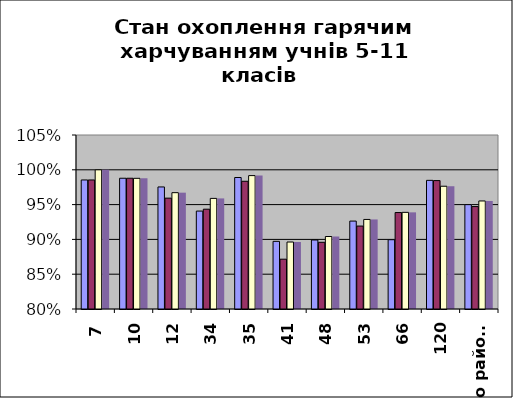
| Category | Series 0 | Series 1 | Series 2 | Series 3 |
|---|---|---|---|---|
| 7 | 0.985 | 0.985 | 1 | 1 |
| 10 | 0.988 | 0.988 | 0.988 | 0.988 |
| 12 | 0.975 | 0.959 | 0.967 | 0.967 |
| 34 | 0.941 | 0.943 | 0.959 | 0.959 |
| 35 | 0.989 | 0.984 | 0.992 | 0.992 |
| 41 | 0.897 | 0.872 | 0.896 | 0.896 |
| 48 | 0.899 | 0.896 | 0.904 | 0.904 |
| 53 | 0.926 | 0.919 | 0.929 | 0.929 |
| 66 | 0.9 | 0.939 | 0.939 | 0.939 |
| 120 | 0.985 | 0.984 | 0.976 | 0.976 |
| по району | 0.95 | 0.947 | 0.955 | 0.955 |